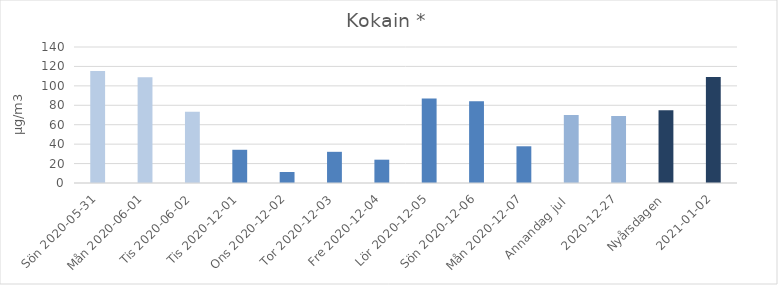
| Category | Kokain * |
|---|---|
| Sön 2020-05-31 | 115.3 |
| Mån 2020-06-01 | 108.9 |
|  Tis 2020-06-02 | 73.4 |
| Tis 2020-12-01 | 34.2 |
| Ons 2020-12-02 | 11.3 |
| Tor 2020-12-03 | 32.1 |
| Fre 2020-12-04 | 24 |
| Lör 2020-12-05 | 87 |
| Sön 2020-12-06 | 84.2 |
| Mån 2020-12-07 | 37.8 |
| Annandag jul  | 70 |
| 2020-12-27 | 69 |
| Nyårsdagen | 75 |
| 2021-01-02 | 109 |